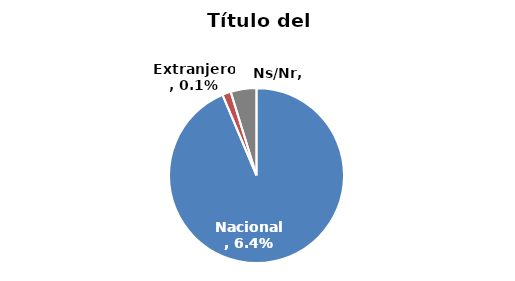
| Category | Series 0 |
|---|---|
| Nacional  | 0.064 |
| Extranjero | 0.001 |
| Ns/Nr | 0.003 |